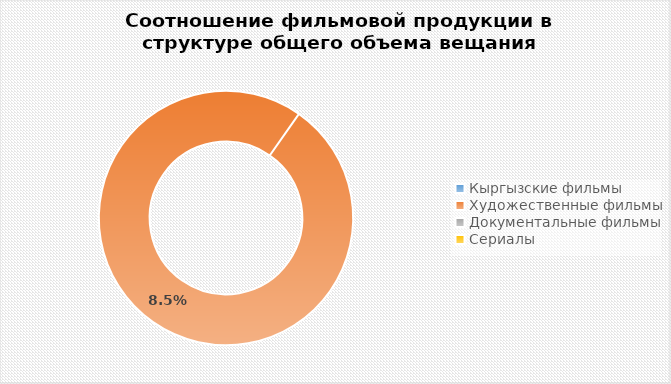
| Category | Series 0 |
|---|---|
| Кыргызские фильмы | 0 |
| Художественные фильмы | 0.085 |
| Документальные фильмы | 0 |
| Сериалы | 0 |